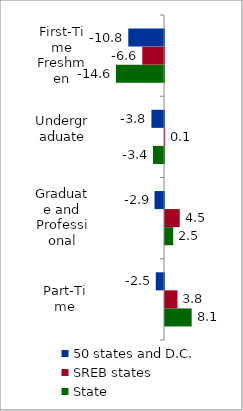
| Category | 50 states and D.C. | SREB states | State |
|---|---|---|---|
| First-Time Freshmen | -10.824 | -6.572 | -14.577 |
| Undergraduate | -3.808 | 0.054 | -3.351 |
| Graduate and Professional | -2.873 | 4.46 | 2.489 |
| Part-Time | -2.493 | 3.777 | 8.085 |